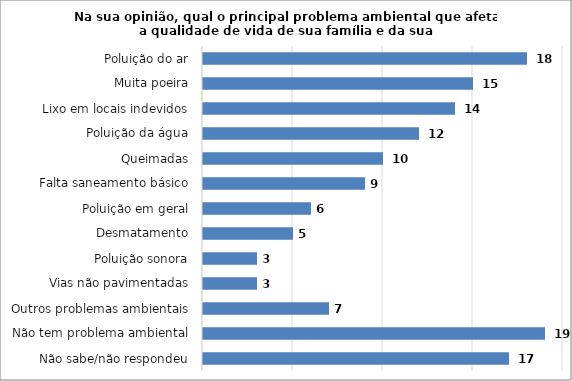
| Category | Series 0 |
|---|---|
| Não sabe/não respondeu | 17 |
| Não tem problema ambiental | 19 |
| Outros problemas ambientais | 7 |
| Vias não pavimentadas | 3 |
| Poluição sonora | 3 |
| Desmatamento | 5 |
| Poluição em geral | 6 |
| Falta saneamento básico | 9 |
| Queimadas | 10 |
| Poluição da água | 12 |
| Lixo em locais indevidos | 14 |
| Muita poeira | 15 |
| Poluição do ar | 18 |